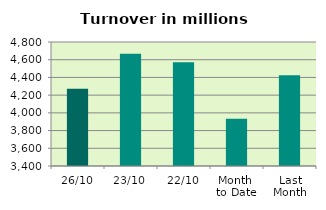
| Category | Series 0 |
|---|---|
| 26/10 | 4272.887 |
| 23/10 | 4665.985 |
| 22/10 | 4572.686 |
| Month 
to Date | 3934.82 |
| Last
Month | 4425.778 |